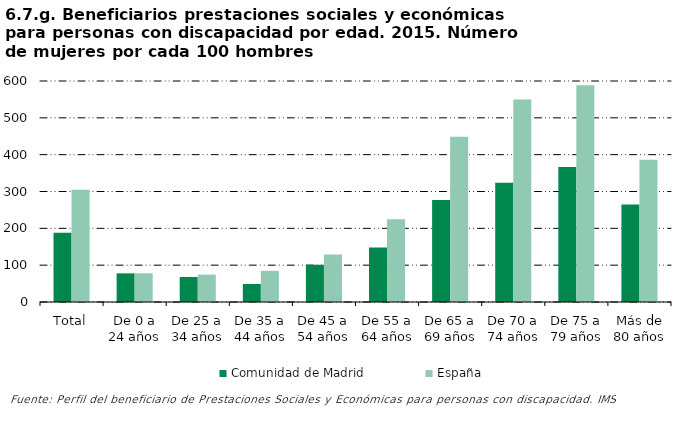
| Category | Comunidad de Madrid | España |
|---|---|---|
| Total | 188.199 | 304.628 |
| De 0 a 24 años | 77.778 | 78.049 |
| De 25 a 34 años | 67.857 | 74.429 |
| De 35 a 44 años | 48.837 | 84.74 |
| De 45 a 54 años | 101.136 | 128.889 |
| De 55 a 64 años | 148.039 | 224.371 |
| De 65 a 69 años | 277.143 | 448.971 |
| De 70 a 74 años | 323.529 | 550 |
| De 75 a 79 años | 366.667 | 588.525 |
| Más de 80 años | 264.865 | 386.119 |